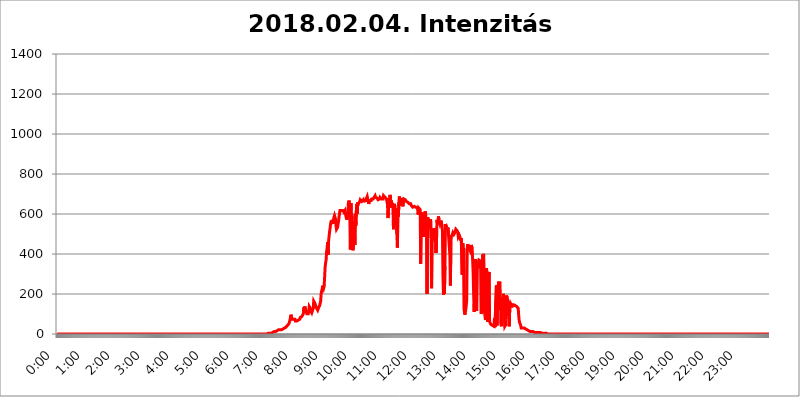
| Category | 2018.02.04. Intenzitás [W/m^2] |
|---|---|
| 0.0 | 0 |
| 0.0006944444444444445 | 0 |
| 0.001388888888888889 | 0 |
| 0.0020833333333333333 | 0 |
| 0.002777777777777778 | 0 |
| 0.003472222222222222 | 0 |
| 0.004166666666666667 | 0 |
| 0.004861111111111111 | 0 |
| 0.005555555555555556 | 0 |
| 0.0062499999999999995 | 0 |
| 0.006944444444444444 | 0 |
| 0.007638888888888889 | 0 |
| 0.008333333333333333 | 0 |
| 0.009027777777777779 | 0 |
| 0.009722222222222222 | 0 |
| 0.010416666666666666 | 0 |
| 0.011111111111111112 | 0 |
| 0.011805555555555555 | 0 |
| 0.012499999999999999 | 0 |
| 0.013194444444444444 | 0 |
| 0.013888888888888888 | 0 |
| 0.014583333333333332 | 0 |
| 0.015277777777777777 | 0 |
| 0.015972222222222224 | 0 |
| 0.016666666666666666 | 0 |
| 0.017361111111111112 | 0 |
| 0.018055555555555557 | 0 |
| 0.01875 | 0 |
| 0.019444444444444445 | 0 |
| 0.02013888888888889 | 0 |
| 0.020833333333333332 | 0 |
| 0.02152777777777778 | 0 |
| 0.022222222222222223 | 0 |
| 0.02291666666666667 | 0 |
| 0.02361111111111111 | 0 |
| 0.024305555555555556 | 0 |
| 0.024999999999999998 | 0 |
| 0.025694444444444447 | 0 |
| 0.02638888888888889 | 0 |
| 0.027083333333333334 | 0 |
| 0.027777777777777776 | 0 |
| 0.02847222222222222 | 0 |
| 0.029166666666666664 | 0 |
| 0.029861111111111113 | 0 |
| 0.030555555555555555 | 0 |
| 0.03125 | 0 |
| 0.03194444444444445 | 0 |
| 0.03263888888888889 | 0 |
| 0.03333333333333333 | 0 |
| 0.034027777777777775 | 0 |
| 0.034722222222222224 | 0 |
| 0.035416666666666666 | 0 |
| 0.036111111111111115 | 0 |
| 0.03680555555555556 | 0 |
| 0.0375 | 0 |
| 0.03819444444444444 | 0 |
| 0.03888888888888889 | 0 |
| 0.03958333333333333 | 0 |
| 0.04027777777777778 | 0 |
| 0.04097222222222222 | 0 |
| 0.041666666666666664 | 0 |
| 0.042361111111111106 | 0 |
| 0.04305555555555556 | 0 |
| 0.043750000000000004 | 0 |
| 0.044444444444444446 | 0 |
| 0.04513888888888889 | 0 |
| 0.04583333333333334 | 0 |
| 0.04652777777777778 | 0 |
| 0.04722222222222222 | 0 |
| 0.04791666666666666 | 0 |
| 0.04861111111111111 | 0 |
| 0.049305555555555554 | 0 |
| 0.049999999999999996 | 0 |
| 0.05069444444444445 | 0 |
| 0.051388888888888894 | 0 |
| 0.052083333333333336 | 0 |
| 0.05277777777777778 | 0 |
| 0.05347222222222222 | 0 |
| 0.05416666666666667 | 0 |
| 0.05486111111111111 | 0 |
| 0.05555555555555555 | 0 |
| 0.05625 | 0 |
| 0.05694444444444444 | 0 |
| 0.057638888888888885 | 0 |
| 0.05833333333333333 | 0 |
| 0.05902777777777778 | 0 |
| 0.059722222222222225 | 0 |
| 0.06041666666666667 | 0 |
| 0.061111111111111116 | 0 |
| 0.06180555555555556 | 0 |
| 0.0625 | 0 |
| 0.06319444444444444 | 0 |
| 0.06388888888888888 | 0 |
| 0.06458333333333334 | 0 |
| 0.06527777777777778 | 0 |
| 0.06597222222222222 | 0 |
| 0.06666666666666667 | 0 |
| 0.06736111111111111 | 0 |
| 0.06805555555555555 | 0 |
| 0.06874999999999999 | 0 |
| 0.06944444444444443 | 0 |
| 0.07013888888888889 | 0 |
| 0.07083333333333333 | 0 |
| 0.07152777777777779 | 0 |
| 0.07222222222222223 | 0 |
| 0.07291666666666667 | 0 |
| 0.07361111111111111 | 0 |
| 0.07430555555555556 | 0 |
| 0.075 | 0 |
| 0.07569444444444444 | 0 |
| 0.0763888888888889 | 0 |
| 0.07708333333333334 | 0 |
| 0.07777777777777778 | 0 |
| 0.07847222222222222 | 0 |
| 0.07916666666666666 | 0 |
| 0.0798611111111111 | 0 |
| 0.08055555555555556 | 0 |
| 0.08125 | 0 |
| 0.08194444444444444 | 0 |
| 0.08263888888888889 | 0 |
| 0.08333333333333333 | 0 |
| 0.08402777777777777 | 0 |
| 0.08472222222222221 | 0 |
| 0.08541666666666665 | 0 |
| 0.08611111111111112 | 0 |
| 0.08680555555555557 | 0 |
| 0.08750000000000001 | 0 |
| 0.08819444444444445 | 0 |
| 0.08888888888888889 | 0 |
| 0.08958333333333333 | 0 |
| 0.09027777777777778 | 0 |
| 0.09097222222222222 | 0 |
| 0.09166666666666667 | 0 |
| 0.09236111111111112 | 0 |
| 0.09305555555555556 | 0 |
| 0.09375 | 0 |
| 0.09444444444444444 | 0 |
| 0.09513888888888888 | 0 |
| 0.09583333333333333 | 0 |
| 0.09652777777777777 | 0 |
| 0.09722222222222222 | 0 |
| 0.09791666666666667 | 0 |
| 0.09861111111111111 | 0 |
| 0.09930555555555555 | 0 |
| 0.09999999999999999 | 0 |
| 0.10069444444444443 | 0 |
| 0.1013888888888889 | 0 |
| 0.10208333333333335 | 0 |
| 0.10277777777777779 | 0 |
| 0.10347222222222223 | 0 |
| 0.10416666666666667 | 0 |
| 0.10486111111111111 | 0 |
| 0.10555555555555556 | 0 |
| 0.10625 | 0 |
| 0.10694444444444444 | 0 |
| 0.1076388888888889 | 0 |
| 0.10833333333333334 | 0 |
| 0.10902777777777778 | 0 |
| 0.10972222222222222 | 0 |
| 0.1111111111111111 | 0 |
| 0.11180555555555556 | 0 |
| 0.11180555555555556 | 0 |
| 0.1125 | 0 |
| 0.11319444444444444 | 0 |
| 0.11388888888888889 | 0 |
| 0.11458333333333333 | 0 |
| 0.11527777777777777 | 0 |
| 0.11597222222222221 | 0 |
| 0.11666666666666665 | 0 |
| 0.1173611111111111 | 0 |
| 0.11805555555555557 | 0 |
| 0.11944444444444445 | 0 |
| 0.12013888888888889 | 0 |
| 0.12083333333333333 | 0 |
| 0.12152777777777778 | 0 |
| 0.12222222222222223 | 0 |
| 0.12291666666666667 | 0 |
| 0.12291666666666667 | 0 |
| 0.12361111111111112 | 0 |
| 0.12430555555555556 | 0 |
| 0.125 | 0 |
| 0.12569444444444444 | 0 |
| 0.12638888888888888 | 0 |
| 0.12708333333333333 | 0 |
| 0.16875 | 0 |
| 0.12847222222222224 | 0 |
| 0.12916666666666668 | 0 |
| 0.12986111111111112 | 0 |
| 0.13055555555555556 | 0 |
| 0.13125 | 0 |
| 0.13194444444444445 | 0 |
| 0.1326388888888889 | 0 |
| 0.13333333333333333 | 0 |
| 0.13402777777777777 | 0 |
| 0.13402777777777777 | 0 |
| 0.13472222222222222 | 0 |
| 0.13541666666666666 | 0 |
| 0.1361111111111111 | 0 |
| 0.13749999999999998 | 0 |
| 0.13819444444444443 | 0 |
| 0.1388888888888889 | 0 |
| 0.13958333333333334 | 0 |
| 0.14027777777777778 | 0 |
| 0.14097222222222222 | 0 |
| 0.14166666666666666 | 0 |
| 0.1423611111111111 | 0 |
| 0.14305555555555557 | 0 |
| 0.14375000000000002 | 0 |
| 0.14444444444444446 | 0 |
| 0.1451388888888889 | 0 |
| 0.1451388888888889 | 0 |
| 0.14652777777777778 | 0 |
| 0.14722222222222223 | 0 |
| 0.14791666666666667 | 0 |
| 0.1486111111111111 | 0 |
| 0.14930555555555555 | 0 |
| 0.15 | 0 |
| 0.15069444444444444 | 0 |
| 0.15138888888888888 | 0 |
| 0.15208333333333332 | 0 |
| 0.15277777777777776 | 0 |
| 0.15347222222222223 | 0 |
| 0.15416666666666667 | 0 |
| 0.15486111111111112 | 0 |
| 0.15555555555555556 | 0 |
| 0.15625 | 0 |
| 0.15694444444444444 | 0 |
| 0.15763888888888888 | 0 |
| 0.15833333333333333 | 0 |
| 0.15902777777777777 | 0 |
| 0.15972222222222224 | 0 |
| 0.16041666666666668 | 0 |
| 0.16111111111111112 | 0 |
| 0.16180555555555556 | 0 |
| 0.1625 | 0 |
| 0.16319444444444445 | 0 |
| 0.1638888888888889 | 0 |
| 0.16458333333333333 | 0 |
| 0.16527777777777777 | 0 |
| 0.16597222222222222 | 0 |
| 0.16666666666666666 | 0 |
| 0.1673611111111111 | 0 |
| 0.16805555555555554 | 0 |
| 0.16874999999999998 | 0 |
| 0.16944444444444443 | 0 |
| 0.17013888888888887 | 0 |
| 0.1708333333333333 | 0 |
| 0.17152777777777775 | 0 |
| 0.17222222222222225 | 0 |
| 0.1729166666666667 | 0 |
| 0.17361111111111113 | 0 |
| 0.17430555555555557 | 0 |
| 0.17500000000000002 | 0 |
| 0.17569444444444446 | 0 |
| 0.1763888888888889 | 0 |
| 0.17708333333333334 | 0 |
| 0.17777777777777778 | 0 |
| 0.17847222222222223 | 0 |
| 0.17916666666666667 | 0 |
| 0.1798611111111111 | 0 |
| 0.18055555555555555 | 0 |
| 0.18125 | 0 |
| 0.18194444444444444 | 0 |
| 0.1826388888888889 | 0 |
| 0.18333333333333335 | 0 |
| 0.1840277777777778 | 0 |
| 0.18472222222222223 | 0 |
| 0.18541666666666667 | 0 |
| 0.18611111111111112 | 0 |
| 0.18680555555555556 | 0 |
| 0.1875 | 0 |
| 0.18819444444444444 | 0 |
| 0.18888888888888888 | 0 |
| 0.18958333333333333 | 0 |
| 0.19027777777777777 | 0 |
| 0.1909722222222222 | 0 |
| 0.19166666666666665 | 0 |
| 0.19236111111111112 | 0 |
| 0.19305555555555554 | 0 |
| 0.19375 | 0 |
| 0.19444444444444445 | 0 |
| 0.1951388888888889 | 0 |
| 0.19583333333333333 | 0 |
| 0.19652777777777777 | 0 |
| 0.19722222222222222 | 0 |
| 0.19791666666666666 | 0 |
| 0.1986111111111111 | 0 |
| 0.19930555555555554 | 0 |
| 0.19999999999999998 | 0 |
| 0.20069444444444443 | 0 |
| 0.20138888888888887 | 0 |
| 0.2020833333333333 | 0 |
| 0.2027777777777778 | 0 |
| 0.2034722222222222 | 0 |
| 0.2041666666666667 | 0 |
| 0.20486111111111113 | 0 |
| 0.20555555555555557 | 0 |
| 0.20625000000000002 | 0 |
| 0.20694444444444446 | 0 |
| 0.2076388888888889 | 0 |
| 0.20833333333333334 | 0 |
| 0.20902777777777778 | 0 |
| 0.20972222222222223 | 0 |
| 0.21041666666666667 | 0 |
| 0.2111111111111111 | 0 |
| 0.21180555555555555 | 0 |
| 0.2125 | 0 |
| 0.21319444444444444 | 0 |
| 0.2138888888888889 | 0 |
| 0.21458333333333335 | 0 |
| 0.2152777777777778 | 0 |
| 0.21597222222222223 | 0 |
| 0.21666666666666667 | 0 |
| 0.21736111111111112 | 0 |
| 0.21805555555555556 | 0 |
| 0.21875 | 0 |
| 0.21944444444444444 | 0 |
| 0.22013888888888888 | 0 |
| 0.22083333333333333 | 0 |
| 0.22152777777777777 | 0 |
| 0.2222222222222222 | 0 |
| 0.22291666666666665 | 0 |
| 0.2236111111111111 | 0 |
| 0.22430555555555556 | 0 |
| 0.225 | 0 |
| 0.22569444444444445 | 0 |
| 0.2263888888888889 | 0 |
| 0.22708333333333333 | 0 |
| 0.22777777777777777 | 0 |
| 0.22847222222222222 | 0 |
| 0.22916666666666666 | 0 |
| 0.2298611111111111 | 0 |
| 0.23055555555555554 | 0 |
| 0.23124999999999998 | 0 |
| 0.23194444444444443 | 0 |
| 0.23263888888888887 | 0 |
| 0.2333333333333333 | 0 |
| 0.2340277777777778 | 0 |
| 0.2347222222222222 | 0 |
| 0.2354166666666667 | 0 |
| 0.23611111111111113 | 0 |
| 0.23680555555555557 | 0 |
| 0.23750000000000002 | 0 |
| 0.23819444444444446 | 0 |
| 0.2388888888888889 | 0 |
| 0.23958333333333334 | 0 |
| 0.24027777777777778 | 0 |
| 0.24097222222222223 | 0 |
| 0.24166666666666667 | 0 |
| 0.2423611111111111 | 0 |
| 0.24305555555555555 | 0 |
| 0.24375 | 0 |
| 0.24444444444444446 | 0 |
| 0.24513888888888888 | 0 |
| 0.24583333333333335 | 0 |
| 0.2465277777777778 | 0 |
| 0.24722222222222223 | 0 |
| 0.24791666666666667 | 0 |
| 0.24861111111111112 | 0 |
| 0.24930555555555556 | 0 |
| 0.25 | 0 |
| 0.25069444444444444 | 0 |
| 0.2513888888888889 | 0 |
| 0.2520833333333333 | 0 |
| 0.25277777777777777 | 0 |
| 0.2534722222222222 | 0 |
| 0.25416666666666665 | 0 |
| 0.2548611111111111 | 0 |
| 0.2555555555555556 | 0 |
| 0.25625000000000003 | 0 |
| 0.2569444444444445 | 0 |
| 0.2576388888888889 | 0 |
| 0.25833333333333336 | 0 |
| 0.2590277777777778 | 0 |
| 0.25972222222222224 | 0 |
| 0.2604166666666667 | 0 |
| 0.2611111111111111 | 0 |
| 0.26180555555555557 | 0 |
| 0.2625 | 0 |
| 0.26319444444444445 | 0 |
| 0.2638888888888889 | 0 |
| 0.26458333333333334 | 0 |
| 0.2652777777777778 | 0 |
| 0.2659722222222222 | 0 |
| 0.26666666666666666 | 0 |
| 0.2673611111111111 | 0 |
| 0.26805555555555555 | 0 |
| 0.26875 | 0 |
| 0.26944444444444443 | 0 |
| 0.2701388888888889 | 0 |
| 0.2708333333333333 | 0 |
| 0.27152777777777776 | 0 |
| 0.2722222222222222 | 0 |
| 0.27291666666666664 | 0 |
| 0.2736111111111111 | 0 |
| 0.2743055555555555 | 0 |
| 0.27499999999999997 | 0 |
| 0.27569444444444446 | 0 |
| 0.27638888888888885 | 0 |
| 0.27708333333333335 | 0 |
| 0.2777777777777778 | 0 |
| 0.27847222222222223 | 0 |
| 0.2791666666666667 | 0 |
| 0.2798611111111111 | 0 |
| 0.28055555555555556 | 0 |
| 0.28125 | 0 |
| 0.28194444444444444 | 0 |
| 0.2826388888888889 | 0 |
| 0.2833333333333333 | 0 |
| 0.28402777777777777 | 0 |
| 0.2847222222222222 | 0 |
| 0.28541666666666665 | 0 |
| 0.28611111111111115 | 0 |
| 0.28680555555555554 | 0 |
| 0.28750000000000003 | 0 |
| 0.2881944444444445 | 0 |
| 0.2888888888888889 | 0 |
| 0.28958333333333336 | 0 |
| 0.2902777777777778 | 0 |
| 0.29097222222222224 | 0 |
| 0.2916666666666667 | 0 |
| 0.2923611111111111 | 0 |
| 0.29305555555555557 | 0 |
| 0.29375 | 0 |
| 0.29444444444444445 | 0 |
| 0.2951388888888889 | 0 |
| 0.29583333333333334 | 3.525 |
| 0.2965277777777778 | 3.525 |
| 0.2972222222222222 | 3.525 |
| 0.29791666666666666 | 3.525 |
| 0.2986111111111111 | 3.525 |
| 0.29930555555555555 | 3.525 |
| 0.3 | 3.525 |
| 0.30069444444444443 | 7.887 |
| 0.3013888888888889 | 7.887 |
| 0.3020833333333333 | 7.887 |
| 0.30277777777777776 | 7.887 |
| 0.3034722222222222 | 12.257 |
| 0.30416666666666664 | 12.257 |
| 0.3048611111111111 | 12.257 |
| 0.3055555555555555 | 12.257 |
| 0.30624999999999997 | 12.257 |
| 0.3069444444444444 | 12.257 |
| 0.3076388888888889 | 16.636 |
| 0.30833333333333335 | 16.636 |
| 0.3090277777777778 | 16.636 |
| 0.30972222222222223 | 16.636 |
| 0.3104166666666667 | 21.024 |
| 0.3111111111111111 | 21.024 |
| 0.31180555555555556 | 21.024 |
| 0.3125 | 21.024 |
| 0.31319444444444444 | 21.024 |
| 0.3138888888888889 | 21.024 |
| 0.3145833333333333 | 21.024 |
| 0.31527777777777777 | 21.024 |
| 0.3159722222222222 | 25.419 |
| 0.31666666666666665 | 25.419 |
| 0.31736111111111115 | 25.419 |
| 0.31805555555555554 | 29.823 |
| 0.31875000000000003 | 29.823 |
| 0.3194444444444445 | 29.823 |
| 0.3201388888888889 | 34.234 |
| 0.32083333333333336 | 34.234 |
| 0.3215277777777778 | 38.653 |
| 0.32222222222222224 | 38.653 |
| 0.3229166666666667 | 43.079 |
| 0.3236111111111111 | 47.511 |
| 0.32430555555555557 | 47.511 |
| 0.325 | 51.951 |
| 0.32569444444444445 | 56.398 |
| 0.3263888888888889 | 69.775 |
| 0.32708333333333334 | 83.205 |
| 0.3277777777777778 | 96.682 |
| 0.3284722222222222 | 92.184 |
| 0.32916666666666666 | 74.246 |
| 0.3298611111111111 | 69.775 |
| 0.33055555555555555 | 69.775 |
| 0.33125 | 74.246 |
| 0.33194444444444443 | 74.246 |
| 0.3326388888888889 | 74.246 |
| 0.3333333333333333 | 74.246 |
| 0.3340277777777778 | 65.31 |
| 0.3347222222222222 | 65.31 |
| 0.3354166666666667 | 65.31 |
| 0.3361111111111111 | 65.31 |
| 0.3368055555555556 | 65.31 |
| 0.33749999999999997 | 65.31 |
| 0.33819444444444446 | 69.775 |
| 0.33888888888888885 | 74.246 |
| 0.33958333333333335 | 74.246 |
| 0.34027777777777773 | 74.246 |
| 0.34097222222222223 | 83.205 |
| 0.3416666666666666 | 87.692 |
| 0.3423611111111111 | 87.692 |
| 0.3430555555555555 | 87.692 |
| 0.34375 | 83.205 |
| 0.3444444444444445 | 83.205 |
| 0.3451388888888889 | 101.184 |
| 0.3458333333333334 | 132.814 |
| 0.34652777777777777 | 123.758 |
| 0.34722222222222227 | 137.347 |
| 0.34791666666666665 | 128.284 |
| 0.34861111111111115 | 119.235 |
| 0.34930555555555554 | 110.201 |
| 0.35000000000000003 | 101.184 |
| 0.3506944444444444 | 96.682 |
| 0.3513888888888889 | 101.184 |
| 0.3520833333333333 | 101.184 |
| 0.3527777777777778 | 110.201 |
| 0.3534722222222222 | 137.347 |
| 0.3541666666666667 | 141.884 |
| 0.3548611111111111 | 128.284 |
| 0.35555555555555557 | 114.716 |
| 0.35625 | 110.201 |
| 0.35694444444444445 | 105.69 |
| 0.3576388888888889 | 105.69 |
| 0.35833333333333334 | 110.201 |
| 0.3590277777777778 | 128.284 |
| 0.3597222222222222 | 164.605 |
| 0.36041666666666666 | 164.605 |
| 0.3611111111111111 | 155.509 |
| 0.36180555555555555 | 155.509 |
| 0.3625 | 141.884 |
| 0.36319444444444443 | 132.814 |
| 0.3638888888888889 | 128.284 |
| 0.3645833333333333 | 128.284 |
| 0.3652777777777778 | 119.235 |
| 0.3659722222222222 | 123.758 |
| 0.3666666666666667 | 132.814 |
| 0.3673611111111111 | 137.347 |
| 0.3680555555555556 | 141.884 |
| 0.36874999999999997 | 141.884 |
| 0.36944444444444446 | 164.605 |
| 0.37013888888888885 | 201.058 |
| 0.37083333333333335 | 214.746 |
| 0.37152777777777773 | 223.873 |
| 0.37222222222222223 | 242.127 |
| 0.3729166666666666 | 246.689 |
| 0.3736111111111111 | 228.436 |
| 0.3743055555555555 | 237.564 |
| 0.375 | 283.156 |
| 0.3756944444444445 | 333.113 |
| 0.3763888888888889 | 355.712 |
| 0.3770833333333334 | 369.23 |
| 0.37777777777777777 | 409.574 |
| 0.37847222222222227 | 427.39 |
| 0.37916666666666665 | 458.38 |
| 0.37986111111111115 | 396.164 |
| 0.38055555555555554 | 462.786 |
| 0.38125000000000003 | 489.108 |
| 0.3819444444444444 | 510.885 |
| 0.3826388888888889 | 528.2 |
| 0.3833333333333333 | 549.704 |
| 0.3840277777777778 | 562.53 |
| 0.3847222222222222 | 562.53 |
| 0.3854166666666667 | 566.793 |
| 0.3861111111111111 | 566.793 |
| 0.38680555555555557 | 566.793 |
| 0.3875 | 549.704 |
| 0.38819444444444445 | 583.779 |
| 0.3888888888888889 | 592.233 |
| 0.38958333333333334 | 592.233 |
| 0.3902777777777778 | 575.299 |
| 0.3909722222222222 | 541.121 |
| 0.39166666666666666 | 523.88 |
| 0.3923611111111111 | 528.2 |
| 0.39305555555555555 | 532.513 |
| 0.39375 | 536.82 |
| 0.39444444444444443 | 562.53 |
| 0.3951388888888889 | 583.779 |
| 0.3958333333333333 | 600.661 |
| 0.3965277777777778 | 617.436 |
| 0.3972222222222222 | 621.613 |
| 0.3979166666666667 | 617.436 |
| 0.3986111111111111 | 617.436 |
| 0.3993055555555556 | 621.613 |
| 0.39999999999999997 | 621.613 |
| 0.40069444444444446 | 617.436 |
| 0.40138888888888885 | 617.436 |
| 0.40208333333333335 | 609.062 |
| 0.40277777777777773 | 609.062 |
| 0.40347222222222223 | 617.436 |
| 0.4041666666666666 | 617.436 |
| 0.4048611111111111 | 588.009 |
| 0.4055555555555555 | 588.009 |
| 0.40625 | 571.049 |
| 0.4069444444444445 | 575.299 |
| 0.4076388888888889 | 609.062 |
| 0.4083333333333334 | 654.791 |
| 0.40902777777777777 | 667.123 |
| 0.40972222222222227 | 658.909 |
| 0.41041666666666665 | 571.049 |
| 0.41111111111111115 | 422.943 |
| 0.41180555555555554 | 654.791 |
| 0.41250000000000003 | 558.261 |
| 0.4131944444444444 | 592.233 |
| 0.4138888888888889 | 440.702 |
| 0.4145833333333333 | 418.492 |
| 0.4152777777777778 | 431.833 |
| 0.4159722222222222 | 453.968 |
| 0.4166666666666667 | 562.53 |
| 0.4173611111111111 | 445.129 |
| 0.41805555555555557 | 600.661 |
| 0.41875 | 541.121 |
| 0.41944444444444445 | 613.252 |
| 0.4201388888888889 | 650.667 |
| 0.42083333333333334 | 600.661 |
| 0.4215277777777778 | 658.909 |
| 0.4222222222222222 | 650.667 |
| 0.42291666666666666 | 650.667 |
| 0.4236111111111111 | 650.667 |
| 0.42430555555555555 | 663.019 |
| 0.425 | 671.22 |
| 0.42569444444444443 | 671.22 |
| 0.4263888888888889 | 675.311 |
| 0.4270833333333333 | 663.019 |
| 0.4277777777777778 | 663.019 |
| 0.4284722222222222 | 667.123 |
| 0.4291666666666667 | 671.22 |
| 0.4298611111111111 | 658.909 |
| 0.4305555555555556 | 667.123 |
| 0.43124999999999997 | 671.22 |
| 0.43194444444444446 | 667.123 |
| 0.43263888888888885 | 667.123 |
| 0.43333333333333335 | 675.311 |
| 0.43402777777777773 | 675.311 |
| 0.43472222222222223 | 687.544 |
| 0.4354166666666666 | 675.311 |
| 0.4361111111111111 | 663.019 |
| 0.4368055555555555 | 650.667 |
| 0.4375 | 658.909 |
| 0.4381944444444445 | 667.123 |
| 0.4388888888888889 | 663.019 |
| 0.4395833333333334 | 663.019 |
| 0.44027777777777777 | 667.123 |
| 0.44097222222222227 | 675.311 |
| 0.44166666666666665 | 675.311 |
| 0.44236111111111115 | 675.311 |
| 0.44305555555555554 | 675.311 |
| 0.44375000000000003 | 679.395 |
| 0.4444444444444444 | 683.473 |
| 0.4451388888888889 | 687.544 |
| 0.4458333333333333 | 691.608 |
| 0.4465277777777778 | 683.473 |
| 0.4472222222222222 | 687.544 |
| 0.4479166666666667 | 683.473 |
| 0.4486111111111111 | 679.395 |
| 0.44930555555555557 | 675.311 |
| 0.45 | 671.22 |
| 0.45069444444444445 | 671.22 |
| 0.4513888888888889 | 667.123 |
| 0.45208333333333334 | 675.311 |
| 0.4527777777777778 | 683.473 |
| 0.4534722222222222 | 687.544 |
| 0.45416666666666666 | 683.473 |
| 0.4548611111111111 | 675.311 |
| 0.45555555555555555 | 675.311 |
| 0.45625 | 671.22 |
| 0.45694444444444443 | 675.311 |
| 0.4576388888888889 | 691.608 |
| 0.4583333333333333 | 695.666 |
| 0.4590277777777778 | 691.608 |
| 0.4597222222222222 | 683.473 |
| 0.4604166666666667 | 679.395 |
| 0.4611111111111111 | 679.395 |
| 0.4618055555555556 | 675.311 |
| 0.46249999999999997 | 671.22 |
| 0.46319444444444446 | 646.537 |
| 0.46388888888888885 | 579.542 |
| 0.46458333333333335 | 629.948 |
| 0.46527777777777773 | 654.791 |
| 0.46597222222222223 | 650.667 |
| 0.4666666666666666 | 695.666 |
| 0.4673611111111111 | 683.473 |
| 0.4680555555555555 | 634.105 |
| 0.46875 | 667.123 |
| 0.4694444444444445 | 629.948 |
| 0.4701388888888889 | 654.791 |
| 0.4708333333333334 | 642.4 |
| 0.47152777777777777 | 523.88 |
| 0.47222222222222227 | 583.779 |
| 0.47291666666666665 | 650.667 |
| 0.47361111111111115 | 634.105 |
| 0.47430555555555554 | 579.542 |
| 0.47500000000000003 | 562.53 |
| 0.4756944444444444 | 575.299 |
| 0.4763888888888889 | 497.836 |
| 0.4770833333333333 | 431.833 |
| 0.4777777777777778 | 629.948 |
| 0.4784722222222222 | 588.009 |
| 0.4791666666666667 | 658.909 |
| 0.4798611111111111 | 687.544 |
| 0.48055555555555557 | 642.4 |
| 0.48125 | 646.537 |
| 0.48194444444444445 | 679.395 |
| 0.4826388888888889 | 683.473 |
| 0.48333333333333334 | 667.123 |
| 0.4840277777777778 | 658.909 |
| 0.4847222222222222 | 638.256 |
| 0.48541666666666666 | 663.019 |
| 0.4861111111111111 | 675.311 |
| 0.48680555555555555 | 679.395 |
| 0.4875 | 679.395 |
| 0.48819444444444443 | 671.22 |
| 0.4888888888888889 | 667.123 |
| 0.4895833333333333 | 663.019 |
| 0.4902777777777778 | 663.019 |
| 0.4909722222222222 | 663.019 |
| 0.4916666666666667 | 658.909 |
| 0.4923611111111111 | 654.791 |
| 0.4930555555555556 | 654.791 |
| 0.49374999999999997 | 650.667 |
| 0.49444444444444446 | 650.667 |
| 0.49513888888888885 | 646.537 |
| 0.49583333333333335 | 650.667 |
| 0.49652777777777773 | 642.4 |
| 0.49722222222222223 | 638.256 |
| 0.4979166666666666 | 638.256 |
| 0.4986111111111111 | 634.105 |
| 0.4993055555555555 | 638.256 |
| 0.5 | 634.105 |
| 0.5006944444444444 | 638.256 |
| 0.5013888888888889 | 638.256 |
| 0.5020833333333333 | 634.105 |
| 0.5027777777777778 | 634.105 |
| 0.5034722222222222 | 634.105 |
| 0.5041666666666667 | 634.105 |
| 0.5048611111111111 | 629.948 |
| 0.5055555555555555 | 621.613 |
| 0.50625 | 596.45 |
| 0.5069444444444444 | 629.948 |
| 0.5076388888888889 | 625.784 |
| 0.5083333333333333 | 625.784 |
| 0.5090277777777777 | 621.613 |
| 0.5097222222222222 | 351.198 |
| 0.5104166666666666 | 571.049 |
| 0.5111111111111112 | 609.062 |
| 0.5118055555555555 | 609.062 |
| 0.5125000000000001 | 562.53 |
| 0.5131944444444444 | 600.661 |
| 0.513888888888889 | 484.735 |
| 0.5145833333333333 | 536.82 |
| 0.5152777777777778 | 596.45 |
| 0.5159722222222222 | 613.252 |
| 0.5166666666666667 | 600.661 |
| 0.517361111111111 | 536.82 |
| 0.5180555555555556 | 558.261 |
| 0.5187499999999999 | 201.058 |
| 0.5194444444444445 | 583.779 |
| 0.5201388888888888 | 575.299 |
| 0.5208333333333334 | 575.299 |
| 0.5215277777777778 | 566.793 |
| 0.5222222222222223 | 566.793 |
| 0.5229166666666667 | 532.513 |
| 0.5236111111111111 | 575.299 |
| 0.5243055555555556 | 480.356 |
| 0.525 | 228.436 |
| 0.5256944444444445 | 510.885 |
| 0.5263888888888889 | 475.972 |
| 0.5270833333333333 | 515.223 |
| 0.5277777777777778 | 528.2 |
| 0.5284722222222222 | 475.972 |
| 0.5291666666666667 | 467.187 |
| 0.5298611111111111 | 528.2 |
| 0.5305555555555556 | 532.513 |
| 0.53125 | 405.108 |
| 0.5319444444444444 | 458.38 |
| 0.5326388888888889 | 571.049 |
| 0.5333333333333333 | 549.704 |
| 0.5340277777777778 | 558.261 |
| 0.5347222222222222 | 588.009 |
| 0.5354166666666667 | 571.049 |
| 0.5361111111111111 | 558.261 |
| 0.5368055555555555 | 549.704 |
| 0.5375 | 549.704 |
| 0.5381944444444444 | 566.793 |
| 0.5388888888888889 | 562.53 |
| 0.5395833333333333 | 541.121 |
| 0.5402777777777777 | 515.223 |
| 0.5409722222222222 | 287.709 |
| 0.5416666666666666 | 196.497 |
| 0.5423611111111112 | 269.49 |
| 0.5430555555555555 | 201.058 |
| 0.5437500000000001 | 337.639 |
| 0.5444444444444444 | 549.704 |
| 0.545138888888889 | 549.704 |
| 0.5458333333333333 | 536.82 |
| 0.5465277777777778 | 536.82 |
| 0.5472222222222222 | 515.223 |
| 0.5479166666666667 | 532.513 |
| 0.548611111111111 | 502.192 |
| 0.5493055555555556 | 467.187 |
| 0.5499999999999999 | 462.786 |
| 0.5506944444444445 | 391.685 |
| 0.5513888888888888 | 242.127 |
| 0.5520833333333334 | 458.38 |
| 0.5527777777777778 | 489.108 |
| 0.5534722222222223 | 493.475 |
| 0.5541666666666667 | 497.836 |
| 0.5548611111111111 | 506.542 |
| 0.5555555555555556 | 506.542 |
| 0.55625 | 497.836 |
| 0.5569444444444445 | 502.192 |
| 0.5576388888888889 | 506.542 |
| 0.5583333333333333 | 510.885 |
| 0.5590277777777778 | 523.88 |
| 0.5597222222222222 | 523.88 |
| 0.5604166666666667 | 519.555 |
| 0.5611111111111111 | 515.223 |
| 0.5618055555555556 | 506.542 |
| 0.5625 | 484.735 |
| 0.5631944444444444 | 484.735 |
| 0.5638888888888889 | 493.475 |
| 0.5645833333333333 | 489.108 |
| 0.5652777777777778 | 480.356 |
| 0.5659722222222222 | 467.187 |
| 0.5666666666666667 | 480.356 |
| 0.5673611111111111 | 484.735 |
| 0.5680555555555555 | 296.808 |
| 0.56875 | 453.968 |
| 0.5694444444444444 | 409.574 |
| 0.5701388888888889 | 427.39 |
| 0.5708333333333333 | 119.235 |
| 0.5715277777777777 | 96.682 |
| 0.5722222222222222 | 105.69 |
| 0.5729166666666666 | 119.235 |
| 0.5736111111111112 | 141.884 |
| 0.5743055555555555 | 169.156 |
| 0.5750000000000001 | 427.39 |
| 0.5756944444444444 | 449.551 |
| 0.576388888888889 | 436.27 |
| 0.5770833333333333 | 431.833 |
| 0.5777777777777778 | 422.943 |
| 0.5784722222222222 | 418.492 |
| 0.5791666666666667 | 414.035 |
| 0.579861111111111 | 431.833 |
| 0.5805555555555556 | 445.129 |
| 0.5812499999999999 | 449.551 |
| 0.5819444444444445 | 427.39 |
| 0.5826388888888888 | 422.943 |
| 0.5833333333333334 | 305.898 |
| 0.5840277777777778 | 196.497 |
| 0.5847222222222223 | 110.201 |
| 0.5854166666666667 | 196.497 |
| 0.5861111111111111 | 160.056 |
| 0.5868055555555556 | 373.729 |
| 0.5875 | 237.564 |
| 0.5881944444444445 | 114.716 |
| 0.5888888888888889 | 360.221 |
| 0.5895833333333333 | 360.221 |
| 0.5902777777777778 | 351.198 |
| 0.5909722222222222 | 328.584 |
| 0.5916666666666667 | 369.23 |
| 0.5923611111111111 | 364.728 |
| 0.5930555555555556 | 369.23 |
| 0.59375 | 364.728 |
| 0.5944444444444444 | 101.184 |
| 0.5951388888888889 | 105.69 |
| 0.5958333333333333 | 114.716 |
| 0.5965277777777778 | 396.164 |
| 0.5972222222222222 | 201.058 |
| 0.5979166666666667 | 400.638 |
| 0.5986111111111111 | 400.638 |
| 0.5993055555555555 | 110.201 |
| 0.6 | 87.692 |
| 0.6006944444444444 | 69.775 |
| 0.6013888888888889 | 65.31 |
| 0.6020833333333333 | 328.584 |
| 0.6027777777777777 | 278.603 |
| 0.6034722222222222 | 60.85 |
| 0.6041666666666666 | 56.398 |
| 0.6048611111111112 | 60.85 |
| 0.6055555555555555 | 310.44 |
| 0.6062500000000001 | 69.775 |
| 0.6069444444444444 | 56.398 |
| 0.607638888888889 | 51.951 |
| 0.6083333333333333 | 47.511 |
| 0.6090277777777778 | 47.511 |
| 0.6097222222222222 | 43.079 |
| 0.6104166666666667 | 43.079 |
| 0.611111111111111 | 38.653 |
| 0.6118055555555556 | 38.653 |
| 0.6124999999999999 | 38.653 |
| 0.6131944444444445 | 78.722 |
| 0.6138888888888888 | 34.234 |
| 0.6145833333333334 | 34.234 |
| 0.6152777777777778 | 38.653 |
| 0.6159722222222223 | 242.127 |
| 0.6166666666666667 | 43.079 |
| 0.6173611111111111 | 43.079 |
| 0.6180555555555556 | 187.378 |
| 0.61875 | 255.813 |
| 0.6194444444444445 | 255.813 |
| 0.6201388888888889 | 255.813 |
| 0.6208333333333333 | 255.813 |
| 0.6215277777777778 | 182.82 |
| 0.6222222222222222 | 47.511 |
| 0.6229166666666667 | 38.653 |
| 0.6236111111111111 | 38.653 |
| 0.6243055555555556 | 146.423 |
| 0.625 | 164.605 |
| 0.6256944444444444 | 201.058 |
| 0.6263888888888889 | 173.709 |
| 0.6270833333333333 | 191.937 |
| 0.6277777777777778 | 38.653 |
| 0.6284722222222222 | 38.653 |
| 0.6291666666666667 | 47.511 |
| 0.6298611111111111 | 191.937 |
| 0.6305555555555555 | 187.378 |
| 0.63125 | 182.82 |
| 0.6319444444444444 | 187.378 |
| 0.6326388888888889 | 92.184 |
| 0.6333333333333333 | 141.884 |
| 0.6340277777777777 | 38.653 |
| 0.6347222222222222 | 146.423 |
| 0.6354166666666666 | 155.509 |
| 0.6361111111111112 | 155.509 |
| 0.6368055555555555 | 146.423 |
| 0.6375000000000001 | 132.814 |
| 0.6381944444444444 | 146.423 |
| 0.638888888888889 | 146.423 |
| 0.6395833333333333 | 146.423 |
| 0.6402777777777778 | 146.423 |
| 0.6409722222222222 | 141.884 |
| 0.6416666666666667 | 141.884 |
| 0.642361111111111 | 141.884 |
| 0.6430555555555556 | 141.884 |
| 0.6437499999999999 | 137.347 |
| 0.6444444444444445 | 137.347 |
| 0.6451388888888888 | 137.347 |
| 0.6458333333333334 | 137.347 |
| 0.6465277777777778 | 128.284 |
| 0.6472222222222223 | 92.184 |
| 0.6479166666666667 | 65.31 |
| 0.6486111111111111 | 56.398 |
| 0.6493055555555556 | 56.398 |
| 0.65 | 43.079 |
| 0.6506944444444445 | 29.823 |
| 0.6513888888888889 | 34.234 |
| 0.6520833333333333 | 29.823 |
| 0.6527777777777778 | 29.823 |
| 0.6534722222222222 | 29.823 |
| 0.6541666666666667 | 25.419 |
| 0.6548611111111111 | 29.823 |
| 0.6555555555555556 | 29.823 |
| 0.65625 | 25.419 |
| 0.6569444444444444 | 25.419 |
| 0.6576388888888889 | 21.024 |
| 0.6583333333333333 | 21.024 |
| 0.6590277777777778 | 21.024 |
| 0.6597222222222222 | 21.024 |
| 0.6604166666666667 | 16.636 |
| 0.6611111111111111 | 16.636 |
| 0.6618055555555555 | 16.636 |
| 0.6625 | 16.636 |
| 0.6631944444444444 | 12.257 |
| 0.6638888888888889 | 16.636 |
| 0.6645833333333333 | 12.257 |
| 0.6652777777777777 | 12.257 |
| 0.6659722222222222 | 12.257 |
| 0.6666666666666666 | 12.257 |
| 0.6673611111111111 | 12.257 |
| 0.6680555555555556 | 12.257 |
| 0.6687500000000001 | 7.887 |
| 0.6694444444444444 | 7.887 |
| 0.6701388888888888 | 7.887 |
| 0.6708333333333334 | 7.887 |
| 0.6715277777777778 | 7.887 |
| 0.6722222222222222 | 7.887 |
| 0.6729166666666666 | 7.887 |
| 0.6736111111111112 | 7.887 |
| 0.6743055555555556 | 7.887 |
| 0.6749999999999999 | 7.887 |
| 0.6756944444444444 | 7.887 |
| 0.6763888888888889 | 7.887 |
| 0.6770833333333334 | 3.525 |
| 0.6777777777777777 | 7.887 |
| 0.6784722222222223 | 3.525 |
| 0.6791666666666667 | 3.525 |
| 0.6798611111111111 | 3.525 |
| 0.6805555555555555 | 3.525 |
| 0.68125 | 3.525 |
| 0.6819444444444445 | 3.525 |
| 0.6826388888888889 | 3.525 |
| 0.6833333333333332 | 3.525 |
| 0.6840277777777778 | 3.525 |
| 0.6847222222222222 | 3.525 |
| 0.6854166666666667 | 3.525 |
| 0.686111111111111 | 3.525 |
| 0.6868055555555556 | 3.525 |
| 0.6875 | 0 |
| 0.6881944444444444 | 0 |
| 0.688888888888889 | 0 |
| 0.6895833333333333 | 0 |
| 0.6902777777777778 | 0 |
| 0.6909722222222222 | 0 |
| 0.6916666666666668 | 0 |
| 0.6923611111111111 | 0 |
| 0.6930555555555555 | 0 |
| 0.69375 | 0 |
| 0.6944444444444445 | 0 |
| 0.6951388888888889 | 0 |
| 0.6958333333333333 | 0 |
| 0.6965277777777777 | 0 |
| 0.6972222222222223 | 0 |
| 0.6979166666666666 | 0 |
| 0.6986111111111111 | 0 |
| 0.6993055555555556 | 0 |
| 0.7000000000000001 | 0 |
| 0.7006944444444444 | 0 |
| 0.7013888888888888 | 0 |
| 0.7020833333333334 | 0 |
| 0.7027777777777778 | 0 |
| 0.7034722222222222 | 0 |
| 0.7041666666666666 | 0 |
| 0.7048611111111112 | 0 |
| 0.7055555555555556 | 0 |
| 0.7062499999999999 | 0 |
| 0.7069444444444444 | 0 |
| 0.7076388888888889 | 0 |
| 0.7083333333333334 | 0 |
| 0.7090277777777777 | 0 |
| 0.7097222222222223 | 0 |
| 0.7104166666666667 | 0 |
| 0.7111111111111111 | 0 |
| 0.7118055555555555 | 0 |
| 0.7125 | 0 |
| 0.7131944444444445 | 0 |
| 0.7138888888888889 | 0 |
| 0.7145833333333332 | 0 |
| 0.7152777777777778 | 0 |
| 0.7159722222222222 | 0 |
| 0.7166666666666667 | 0 |
| 0.717361111111111 | 0 |
| 0.7180555555555556 | 0 |
| 0.71875 | 0 |
| 0.7194444444444444 | 0 |
| 0.720138888888889 | 0 |
| 0.7208333333333333 | 0 |
| 0.7215277777777778 | 0 |
| 0.7222222222222222 | 0 |
| 0.7229166666666668 | 0 |
| 0.7236111111111111 | 0 |
| 0.7243055555555555 | 0 |
| 0.725 | 0 |
| 0.7256944444444445 | 0 |
| 0.7263888888888889 | 0 |
| 0.7270833333333333 | 0 |
| 0.7277777777777777 | 0 |
| 0.7284722222222223 | 0 |
| 0.7291666666666666 | 0 |
| 0.7298611111111111 | 0 |
| 0.7305555555555556 | 0 |
| 0.7312500000000001 | 0 |
| 0.7319444444444444 | 0 |
| 0.7326388888888888 | 0 |
| 0.7333333333333334 | 0 |
| 0.7340277777777778 | 0 |
| 0.7347222222222222 | 0 |
| 0.7354166666666666 | 0 |
| 0.7361111111111112 | 0 |
| 0.7368055555555556 | 0 |
| 0.7374999999999999 | 0 |
| 0.7381944444444444 | 0 |
| 0.7388888888888889 | 0 |
| 0.7395833333333334 | 0 |
| 0.7402777777777777 | 0 |
| 0.7409722222222223 | 0 |
| 0.7416666666666667 | 0 |
| 0.7423611111111111 | 0 |
| 0.7430555555555555 | 0 |
| 0.74375 | 0 |
| 0.7444444444444445 | 0 |
| 0.7451388888888889 | 0 |
| 0.7458333333333332 | 0 |
| 0.7465277777777778 | 0 |
| 0.7472222222222222 | 0 |
| 0.7479166666666667 | 0 |
| 0.748611111111111 | 0 |
| 0.7493055555555556 | 0 |
| 0.75 | 0 |
| 0.7506944444444444 | 0 |
| 0.751388888888889 | 0 |
| 0.7520833333333333 | 0 |
| 0.7527777777777778 | 0 |
| 0.7534722222222222 | 0 |
| 0.7541666666666668 | 0 |
| 0.7548611111111111 | 0 |
| 0.7555555555555555 | 0 |
| 0.75625 | 0 |
| 0.7569444444444445 | 0 |
| 0.7576388888888889 | 0 |
| 0.7583333333333333 | 0 |
| 0.7590277777777777 | 0 |
| 0.7597222222222223 | 0 |
| 0.7604166666666666 | 0 |
| 0.7611111111111111 | 0 |
| 0.7618055555555556 | 0 |
| 0.7625000000000001 | 0 |
| 0.7631944444444444 | 0 |
| 0.7638888888888888 | 0 |
| 0.7645833333333334 | 0 |
| 0.7652777777777778 | 0 |
| 0.7659722222222222 | 0 |
| 0.7666666666666666 | 0 |
| 0.7673611111111112 | 0 |
| 0.7680555555555556 | 0 |
| 0.7687499999999999 | 0 |
| 0.7694444444444444 | 0 |
| 0.7701388888888889 | 0 |
| 0.7708333333333334 | 0 |
| 0.7715277777777777 | 0 |
| 0.7722222222222223 | 0 |
| 0.7729166666666667 | 0 |
| 0.7736111111111111 | 0 |
| 0.7743055555555555 | 0 |
| 0.775 | 0 |
| 0.7756944444444445 | 0 |
| 0.7763888888888889 | 0 |
| 0.7770833333333332 | 0 |
| 0.7777777777777778 | 0 |
| 0.7784722222222222 | 0 |
| 0.7791666666666667 | 0 |
| 0.779861111111111 | 0 |
| 0.7805555555555556 | 0 |
| 0.78125 | 0 |
| 0.7819444444444444 | 0 |
| 0.782638888888889 | 0 |
| 0.7833333333333333 | 0 |
| 0.7840277777777778 | 0 |
| 0.7847222222222222 | 0 |
| 0.7854166666666668 | 0 |
| 0.7861111111111111 | 0 |
| 0.7868055555555555 | 0 |
| 0.7875 | 0 |
| 0.7881944444444445 | 0 |
| 0.7888888888888889 | 0 |
| 0.7895833333333333 | 0 |
| 0.7902777777777777 | 0 |
| 0.7909722222222223 | 0 |
| 0.7916666666666666 | 0 |
| 0.7923611111111111 | 0 |
| 0.7930555555555556 | 0 |
| 0.7937500000000001 | 0 |
| 0.7944444444444444 | 0 |
| 0.7951388888888888 | 0 |
| 0.7958333333333334 | 0 |
| 0.7965277777777778 | 0 |
| 0.7972222222222222 | 0 |
| 0.7979166666666666 | 0 |
| 0.7986111111111112 | 0 |
| 0.7993055555555556 | 0 |
| 0.7999999999999999 | 0 |
| 0.8006944444444444 | 0 |
| 0.8013888888888889 | 0 |
| 0.8020833333333334 | 0 |
| 0.8027777777777777 | 0 |
| 0.8034722222222223 | 0 |
| 0.8041666666666667 | 0 |
| 0.8048611111111111 | 0 |
| 0.8055555555555555 | 0 |
| 0.80625 | 0 |
| 0.8069444444444445 | 0 |
| 0.8076388888888889 | 0 |
| 0.8083333333333332 | 0 |
| 0.8090277777777778 | 0 |
| 0.8097222222222222 | 0 |
| 0.8104166666666667 | 0 |
| 0.811111111111111 | 0 |
| 0.8118055555555556 | 0 |
| 0.8125 | 0 |
| 0.8131944444444444 | 0 |
| 0.813888888888889 | 0 |
| 0.8145833333333333 | 0 |
| 0.8152777777777778 | 0 |
| 0.8159722222222222 | 0 |
| 0.8166666666666668 | 0 |
| 0.8173611111111111 | 0 |
| 0.8180555555555555 | 0 |
| 0.81875 | 0 |
| 0.8194444444444445 | 0 |
| 0.8201388888888889 | 0 |
| 0.8208333333333333 | 0 |
| 0.8215277777777777 | 0 |
| 0.8222222222222223 | 0 |
| 0.8229166666666666 | 0 |
| 0.8236111111111111 | 0 |
| 0.8243055555555556 | 0 |
| 0.8250000000000001 | 0 |
| 0.8256944444444444 | 0 |
| 0.8263888888888888 | 0 |
| 0.8270833333333334 | 0 |
| 0.8277777777777778 | 0 |
| 0.8284722222222222 | 0 |
| 0.8291666666666666 | 0 |
| 0.8298611111111112 | 0 |
| 0.8305555555555556 | 0 |
| 0.8312499999999999 | 0 |
| 0.8319444444444444 | 0 |
| 0.8326388888888889 | 0 |
| 0.8333333333333334 | 0 |
| 0.8340277777777777 | 0 |
| 0.8347222222222223 | 0 |
| 0.8354166666666667 | 0 |
| 0.8361111111111111 | 0 |
| 0.8368055555555555 | 0 |
| 0.8375 | 0 |
| 0.8381944444444445 | 0 |
| 0.8388888888888889 | 0 |
| 0.8395833333333332 | 0 |
| 0.8402777777777778 | 0 |
| 0.8409722222222222 | 0 |
| 0.8416666666666667 | 0 |
| 0.842361111111111 | 0 |
| 0.8430555555555556 | 0 |
| 0.84375 | 0 |
| 0.8444444444444444 | 0 |
| 0.845138888888889 | 0 |
| 0.8458333333333333 | 0 |
| 0.8465277777777778 | 0 |
| 0.8472222222222222 | 0 |
| 0.8479166666666668 | 0 |
| 0.8486111111111111 | 0 |
| 0.8493055555555555 | 0 |
| 0.85 | 0 |
| 0.8506944444444445 | 0 |
| 0.8513888888888889 | 0 |
| 0.8520833333333333 | 0 |
| 0.8527777777777777 | 0 |
| 0.8534722222222223 | 0 |
| 0.8541666666666666 | 0 |
| 0.8548611111111111 | 0 |
| 0.8555555555555556 | 0 |
| 0.8562500000000001 | 0 |
| 0.8569444444444444 | 0 |
| 0.8576388888888888 | 0 |
| 0.8583333333333334 | 0 |
| 0.8590277777777778 | 0 |
| 0.8597222222222222 | 0 |
| 0.8604166666666666 | 0 |
| 0.8611111111111112 | 0 |
| 0.8618055555555556 | 0 |
| 0.8624999999999999 | 0 |
| 0.8631944444444444 | 0 |
| 0.8638888888888889 | 0 |
| 0.8645833333333334 | 0 |
| 0.8652777777777777 | 0 |
| 0.8659722222222223 | 0 |
| 0.8666666666666667 | 0 |
| 0.8673611111111111 | 0 |
| 0.8680555555555555 | 0 |
| 0.86875 | 0 |
| 0.8694444444444445 | 0 |
| 0.8701388888888889 | 0 |
| 0.8708333333333332 | 0 |
| 0.8715277777777778 | 0 |
| 0.8722222222222222 | 0 |
| 0.8729166666666667 | 0 |
| 0.873611111111111 | 0 |
| 0.8743055555555556 | 0 |
| 0.875 | 0 |
| 0.8756944444444444 | 0 |
| 0.876388888888889 | 0 |
| 0.8770833333333333 | 0 |
| 0.8777777777777778 | 0 |
| 0.8784722222222222 | 0 |
| 0.8791666666666668 | 0 |
| 0.8798611111111111 | 0 |
| 0.8805555555555555 | 0 |
| 0.88125 | 0 |
| 0.8819444444444445 | 0 |
| 0.8826388888888889 | 0 |
| 0.8833333333333333 | 0 |
| 0.8840277777777777 | 0 |
| 0.8847222222222223 | 0 |
| 0.8854166666666666 | 0 |
| 0.8861111111111111 | 0 |
| 0.8868055555555556 | 0 |
| 0.8875000000000001 | 0 |
| 0.8881944444444444 | 0 |
| 0.8888888888888888 | 0 |
| 0.8895833333333334 | 0 |
| 0.8902777777777778 | 0 |
| 0.8909722222222222 | 0 |
| 0.8916666666666666 | 0 |
| 0.8923611111111112 | 0 |
| 0.8930555555555556 | 0 |
| 0.8937499999999999 | 0 |
| 0.8944444444444444 | 0 |
| 0.8951388888888889 | 0 |
| 0.8958333333333334 | 0 |
| 0.8965277777777777 | 0 |
| 0.8972222222222223 | 0 |
| 0.8979166666666667 | 0 |
| 0.8986111111111111 | 0 |
| 0.8993055555555555 | 0 |
| 0.9 | 0 |
| 0.9006944444444445 | 0 |
| 0.9013888888888889 | 0 |
| 0.9020833333333332 | 0 |
| 0.9027777777777778 | 0 |
| 0.9034722222222222 | 0 |
| 0.9041666666666667 | 0 |
| 0.904861111111111 | 0 |
| 0.9055555555555556 | 0 |
| 0.90625 | 0 |
| 0.9069444444444444 | 0 |
| 0.907638888888889 | 0 |
| 0.9083333333333333 | 0 |
| 0.9090277777777778 | 0 |
| 0.9097222222222222 | 0 |
| 0.9104166666666668 | 0 |
| 0.9111111111111111 | 0 |
| 0.9118055555555555 | 0 |
| 0.9125 | 0 |
| 0.9131944444444445 | 0 |
| 0.9138888888888889 | 0 |
| 0.9145833333333333 | 0 |
| 0.9152777777777777 | 0 |
| 0.9159722222222223 | 0 |
| 0.9166666666666666 | 0 |
| 0.9173611111111111 | 0 |
| 0.9180555555555556 | 0 |
| 0.9187500000000001 | 0 |
| 0.9194444444444444 | 0 |
| 0.9201388888888888 | 0 |
| 0.9208333333333334 | 0 |
| 0.9215277777777778 | 0 |
| 0.9222222222222222 | 0 |
| 0.9229166666666666 | 0 |
| 0.9236111111111112 | 0 |
| 0.9243055555555556 | 0 |
| 0.9249999999999999 | 0 |
| 0.9256944444444444 | 0 |
| 0.9263888888888889 | 0 |
| 0.9270833333333334 | 0 |
| 0.9277777777777777 | 0 |
| 0.9284722222222223 | 0 |
| 0.9291666666666667 | 0 |
| 0.9298611111111111 | 0 |
| 0.9305555555555555 | 0 |
| 0.93125 | 0 |
| 0.9319444444444445 | 0 |
| 0.9326388888888889 | 0 |
| 0.9333333333333332 | 0 |
| 0.9340277777777778 | 0 |
| 0.9347222222222222 | 0 |
| 0.9354166666666667 | 0 |
| 0.936111111111111 | 0 |
| 0.9368055555555556 | 0 |
| 0.9375 | 0 |
| 0.9381944444444444 | 0 |
| 0.938888888888889 | 0 |
| 0.9395833333333333 | 0 |
| 0.9402777777777778 | 0 |
| 0.9409722222222222 | 0 |
| 0.9416666666666668 | 0 |
| 0.9423611111111111 | 0 |
| 0.9430555555555555 | 0 |
| 0.94375 | 0 |
| 0.9444444444444445 | 0 |
| 0.9451388888888889 | 0 |
| 0.9458333333333333 | 0 |
| 0.9465277777777777 | 0 |
| 0.9472222222222223 | 0 |
| 0.9479166666666666 | 0 |
| 0.9486111111111111 | 0 |
| 0.9493055555555556 | 0 |
| 0.9500000000000001 | 0 |
| 0.9506944444444444 | 0 |
| 0.9513888888888888 | 0 |
| 0.9520833333333334 | 0 |
| 0.9527777777777778 | 0 |
| 0.9534722222222222 | 0 |
| 0.9541666666666666 | 0 |
| 0.9548611111111112 | 0 |
| 0.9555555555555556 | 0 |
| 0.9562499999999999 | 0 |
| 0.9569444444444444 | 0 |
| 0.9576388888888889 | 0 |
| 0.9583333333333334 | 0 |
| 0.9590277777777777 | 0 |
| 0.9597222222222223 | 0 |
| 0.9604166666666667 | 0 |
| 0.9611111111111111 | 0 |
| 0.9618055555555555 | 0 |
| 0.9625 | 0 |
| 0.9631944444444445 | 0 |
| 0.9638888888888889 | 0 |
| 0.9645833333333332 | 0 |
| 0.9652777777777778 | 0 |
| 0.9659722222222222 | 0 |
| 0.9666666666666667 | 0 |
| 0.967361111111111 | 0 |
| 0.9680555555555556 | 0 |
| 0.96875 | 0 |
| 0.9694444444444444 | 0 |
| 0.970138888888889 | 0 |
| 0.9708333333333333 | 0 |
| 0.9715277777777778 | 0 |
| 0.9722222222222222 | 0 |
| 0.9729166666666668 | 0 |
| 0.9736111111111111 | 0 |
| 0.9743055555555555 | 0 |
| 0.975 | 0 |
| 0.9756944444444445 | 0 |
| 0.9763888888888889 | 0 |
| 0.9770833333333333 | 0 |
| 0.9777777777777777 | 0 |
| 0.9784722222222223 | 0 |
| 0.9791666666666666 | 0 |
| 0.9798611111111111 | 0 |
| 0.9805555555555556 | 0 |
| 0.9812500000000001 | 0 |
| 0.9819444444444444 | 0 |
| 0.9826388888888888 | 0 |
| 0.9833333333333334 | 0 |
| 0.9840277777777778 | 0 |
| 0.9847222222222222 | 0 |
| 0.9854166666666666 | 0 |
| 0.9861111111111112 | 0 |
| 0.9868055555555556 | 0 |
| 0.9874999999999999 | 0 |
| 0.9881944444444444 | 0 |
| 0.9888888888888889 | 0 |
| 0.9895833333333334 | 0 |
| 0.9902777777777777 | 0 |
| 0.9909722222222223 | 0 |
| 0.9916666666666667 | 0 |
| 0.9923611111111111 | 0 |
| 0.9930555555555555 | 0 |
| 0.99375 | 0 |
| 0.9944444444444445 | 0 |
| 0.9951388888888889 | 0 |
| 0.9958333333333332 | 0 |
| 0.9965277777777778 | 0 |
| 0.9972222222222222 | 0 |
| 0.9979166666666667 | 0 |
| 0.998611111111111 | 0 |
| 0.9993055555555556 | 0 |